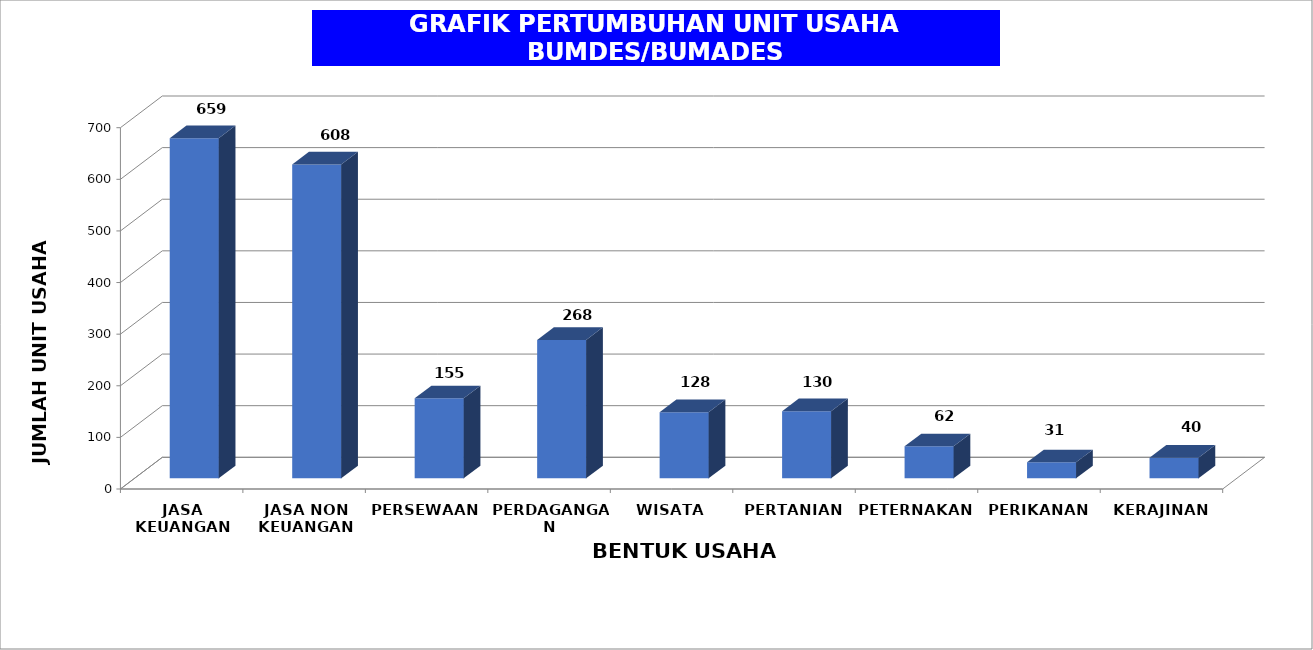
| Category | Series 0 |
|---|---|
| JASA KEUANGAN | 659 |
| JASA NON KEUANGAN | 608 |
| PERSEWAAN | 155 |
| PERDAGANGAN | 268 |
| WISATA | 128 |
| PERTANIAN | 130 |
| PETERNAKAN | 62 |
| PERIKANAN | 31 |
| KERAJINAN | 40 |